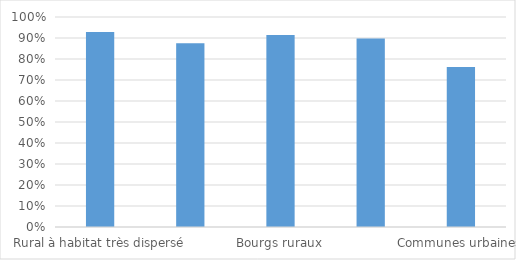
| Category | Taux d'autofinacement des investissements |
|---|---|
| Rural à habitat très dispersé | 0.928 |
| Rural à habitat dispersé | 0.876 |
| Bourgs ruraux | 0.915 |
| Ensemble communes rurales | 0.898 |
| Communes urbaines | 0.762 |